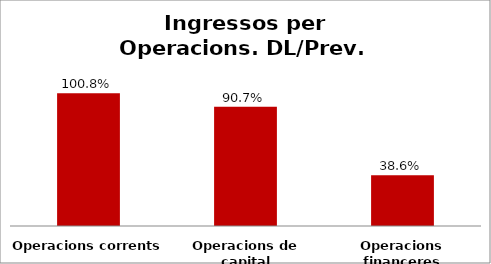
| Category | Series 0 |
|---|---|
| Operacions corrents | 1.008 |
| Operacions de capital | 0.907 |
| Operacions financeres | 0.386 |